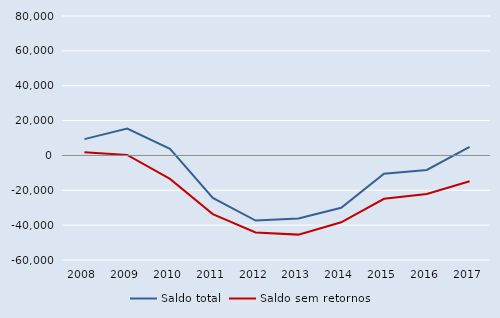
| Category | Saldo total | Saldo sem retornos |
|---|---|---|
| 2008.0 | 9361 | 1760 |
| 2009.0 | 15408 | 286 |
| 2010.0 | 3815 | -13443 |
| 2011.0 | -24331 | -33648 |
| 2012.0 | -37352 | -44186 |
| 2013.0 | -36232 | -45437 |
| 2014.0 | -30056 | -38367 |
| 2015.0 | -10481 | -24900 |
| 2016.0 | -8348 | -22125 |
| 2017.0 | 4886 | -14782 |